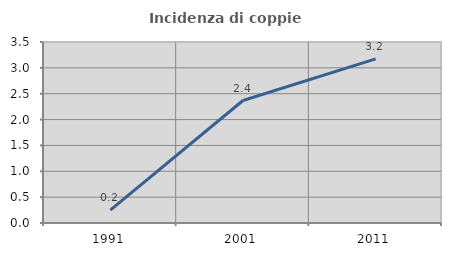
| Category | Incidenza di coppie miste |
|---|---|
| 1991.0 | 0.249 |
| 2001.0 | 2.368 |
| 2011.0 | 3.175 |